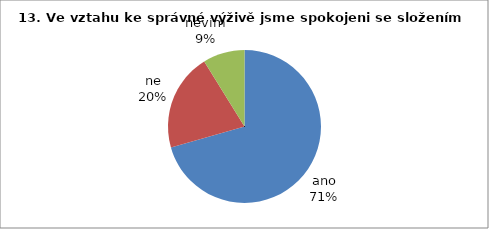
| Category | 13. |
|---|---|
| ano | 24 |
| ne | 7 |
| nevím | 3 |